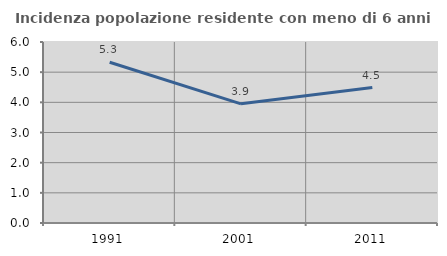
| Category | Incidenza popolazione residente con meno di 6 anni |
|---|---|
| 1991.0 | 5.329 |
| 2001.0 | 3.95 |
| 2011.0 | 4.491 |